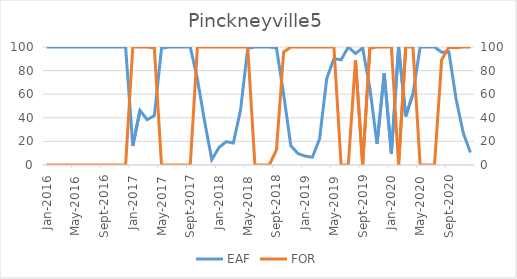
| Category | EAF |
|---|---|
| 2016-01-01 | 100 |
| 2016-02-01 | 100 |
| 2016-03-01 | 100 |
| 2016-04-01 | 100 |
| 2016-05-01 | 100 |
| 2016-06-01 | 100 |
| 2016-07-01 | 100 |
| 2016-08-01 | 100 |
| 2016-09-01 | 100 |
| 2016-10-01 | 100 |
| 2016-11-01 | 100 |
| 2016-12-01 | 100 |
| 2017-01-01 | 16.13 |
| 2017-02-01 | 46.28 |
| 2017-03-01 | 38.44 |
| 2017-04-01 | 41.88 |
| 2017-05-01 | 98.89 |
| 2017-06-01 | 100 |
| 2017-07-01 | 100 |
| 2017-08-01 | 100 |
| 2017-09-01 | 100 |
| 2017-10-01 | 72.62 |
| 2017-11-01 | 36.88 |
| 2017-12-01 | 4.51 |
| 2018-01-01 | 14.81 |
| 2018-02-01 | 19.78 |
| 2018-03-01 | 18.62 |
| 2018-04-01 | 46.58 |
| 2018-05-01 | 98.93 |
| 2018-06-01 | 100 |
| 2018-07-01 | 100 |
| 2018-08-01 | 100 |
| 2018-09-01 | 99.31 |
| 2018-10-01 | 60.09 |
| 2018-11-01 | 16.26 |
| 2018-12-01 | 9.7 |
| 2019-01-01 | 7.54 |
| 2019-02-01 | 6.56 |
| 2019-03-01 | 22.11 |
| 2019-04-01 | 73.23 |
| 2019-05-01 | 90.21 |
| 2019-06-01 | 89.13 |
| 2019-07-01 | 100 |
| 2019-08-01 | 94.49 |
| 2019-09-01 | 99.1 |
| 2019-10-01 | 65.36 |
| 2019-11-01 | 17.93 |
| 2019-12-01 | 77.7 |
| 2020-01-01 | 9.56 |
| 2020-02-01 | 100 |
| 2020-03-01 | 41.23 |
| 2020-04-01 | 60.19 |
| 2020-05-01 | 100 |
| 2020-06-01 | 100 |
| 2020-07-01 | 100 |
| 2020-08-01 | 95.49 |
| 2020-09-01 | 95.85 |
| 2020-10-01 | 56.09 |
| 2020-11-01 | 27.36 |
| 2020-12-01 | 10.64 |